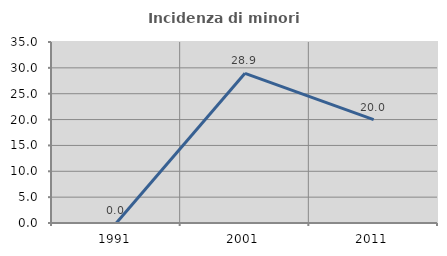
| Category | Incidenza di minori stranieri |
|---|---|
| 1991.0 | 0 |
| 2001.0 | 28.947 |
| 2011.0 | 20 |